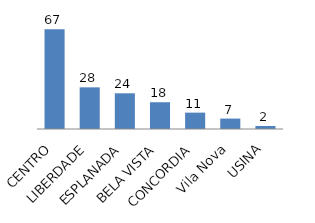
| Category | Series 0 |
|---|---|
| CENTRO | 67 |
| LIBERDADE | 28 |
| ESPLANADA | 24 |
| BELA VISTA | 18 |
| CONCORDIA | 11 |
| Vila Nova | 7 |
| USINA | 2 |